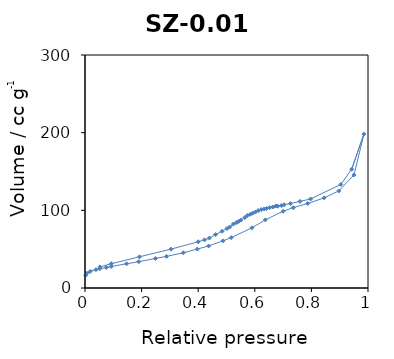
| Category | Series 0 |
|---|---|
| 0.002024 | 16.118 |
| 0.006623 | 18.835 |
| 0.018423 | 21.382 |
| 0.038623 | 23.633 |
| 0.051766 | 24.759 |
| 0.075243 | 26.439 |
| 0.092487 | 27.689 |
| 0.146923 | 31.155 |
| 0.190241 | 33.915 |
| 0.249128 | 37.984 |
| 0.28783 | 40.737 |
| 0.347411 | 45.324 |
| 0.396785 | 50.113 |
| 0.436932 | 54.12 |
| 0.487696 | 60.712 |
| 0.516429 | 64.849 |
| 0.589766 | 77.487 |
| 0.637224 | 87.746 |
| 0.700161 | 98.86 |
| 0.735756 | 103.41 |
| 0.787244 | 108.857 |
| 0.845062 | 116.038 |
| 0.897072 | 125.024 |
| 0.950558 | 145.589 |
| 0.98557 | 198.159 |
| 0.942393 | 152.862 |
| 0.90405 | 133.324 |
| 0.797204 | 114.638 |
| 0.759672 | 111.502 |
| 0.725752 | 108.708 |
| 0.703494 | 107.253 |
| 0.694195 | 106.03 |
| 0.68102 | 105.427 |
| 0.674909 | 105.643 |
| 0.664015 | 104.22 |
| 0.652604 | 103.543 |
| 0.64156 | 102.433 |
| 0.633157 | 101.762 |
| 0.622713 | 101.018 |
| 0.612345 | 99.683 |
| 0.602579 | 97.908 |
| 0.592259 | 96.38 |
| 0.584145 | 94.957 |
| 0.573663 | 93.412 |
| 0.564785 | 90.6 |
| 0.55082 | 87.39 |
| 0.542848 | 85.746 |
| 0.53457 | 84.152 |
| 0.524258 | 82.284 |
| 0.511165 | 78.497 |
| 0.501877 | 76.567 |
| 0.484375 | 73.069 |
| 0.461214 | 68.742 |
| 0.439622 | 64.313 |
| 0.422433 | 61.943 |
| 0.400075 | 59.534 |
| 0.30367 | 50.029 |
| 0.19251 | 40.197 |
| 0.092883 | 31.272 |
| 0.053071 | 27.228 |